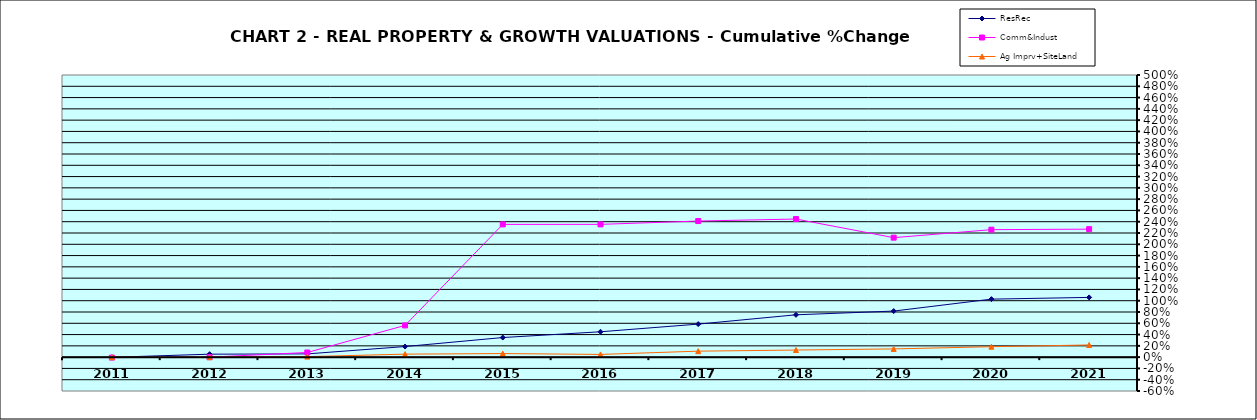
| Category | ResRec | Comm&Indust | Ag Imprv+SiteLand |
|---|---|---|---|
| 2011.0 | -0.003 | -0.008 | 0 |
| 2012.0 | 0.053 | 0 | -0.002 |
| 2013.0 | 0.058 | 0.083 | 0.009 |
| 2014.0 | 0.188 | 0.562 | 0.053 |
| 2015.0 | 0.347 | 2.353 | 0.064 |
| 2016.0 | 0.45 | 2.353 | 0.048 |
| 2017.0 | 0.585 | 2.412 | 0.106 |
| 2018.0 | 0.75 | 2.447 | 0.126 |
| 2019.0 | 0.816 | 2.118 | 0.146 |
| 2020.0 | 1.028 | 2.259 | 0.185 |
| 2021.0 | 1.059 | 2.268 | 0.216 |